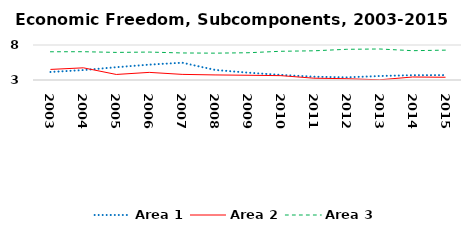
| Category | Area 1 | Area 2 | Area 3 |
|---|---|---|---|
| 2003.0 | 4.146 | 4.51 | 7.032 |
| 2004.0 | 4.419 | 4.74 | 7.041 |
| 2005.0 | 4.829 | 3.792 | 6.942 |
| 2006.0 | 5.195 | 4.087 | 6.99 |
| 2007.0 | 5.47 | 3.802 | 6.863 |
| 2008.0 | 4.44 | 3.724 | 6.835 |
| 2009.0 | 4.049 | 3.677 | 6.894 |
| 2010.0 | 3.726 | 3.621 | 7.104 |
| 2011.0 | 3.47 | 3.259 | 7.171 |
| 2012.0 | 3.38 | 3.184 | 7.386 |
| 2013.0 | 3.569 | 3.03 | 7.43 |
| 2014.0 | 3.689 | 3.427 | 7.187 |
| 2015.0 | 3.701 | 3.392 | 7.267 |